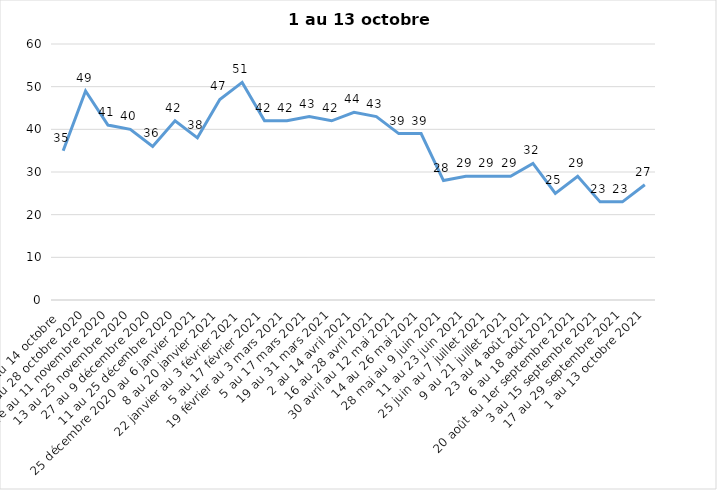
| Category | Toujours aux trois mesures |
|---|---|
| 2 au 14 octobre  | 35 |
| 16 au 28 octobre 2020 | 49 |
| 30 octobre au 11 novembre 2020 | 41 |
| 13 au 25 novembre 2020 | 40 |
| 27 au 9 décembre 2020 | 36 |
| 11 au 25 décembre 2020 | 42 |
| 25 décembre 2020 au 6 janvier 2021 | 38 |
| 8 au 20 janvier 2021 | 47 |
| 22 janvier au 3 février 2021 | 51 |
| 5 au 17 février 2021 | 42 |
| 19 février au 3 mars 2021 | 42 |
| 5 au 17 mars 2021 | 43 |
| 19 au 31 mars 2021 | 42 |
| 2 au 14 avril 2021 | 44 |
| 16 au 28 avril 2021 | 43 |
| 30 avril au 12 mai 2021 | 39 |
| 14 au 26 mai 2021 | 39 |
| 28 mai au 9 juin 2021 | 28 |
| 11 au 23 juin 2021 | 29 |
| 25 juin au 7 juillet 2021 | 29 |
| 9 au 21 juillet 2021 | 29 |
| 23 au 4 août 2021 | 32 |
| 6 au 18 août 2021 | 25 |
| 20 août au 1er septembre 2021 | 29 |
| 3 au 15 septembre 2021 | 23 |
| 17 au 29 septembre 2021 | 23 |
| 1 au 13 octobre 2021 | 27 |